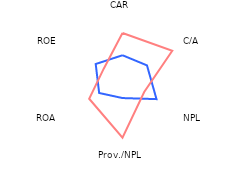
| Category | Serbia | Region |
|---|---|---|
| CAR | 1.732 | 3.325 |
| C/A | 2.018 | 4.105 |
| NPL | 2.804 | 1.789 |
| Prov./NPL | 1.326 | 4.153 |
| ROA | 1.926 | 2.748 |
| ROE | 2.21 | 1.547 |